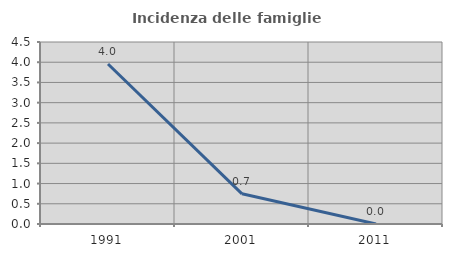
| Category | Incidenza delle famiglie numerose |
|---|---|
| 1991.0 | 3.957 |
| 2001.0 | 0.746 |
| 2011.0 | 0 |